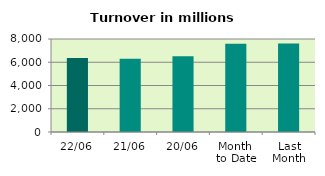
| Category | Series 0 |
|---|---|
| 22/06 | 6357.181 |
| 21/06 | 6295.404 |
| 20/06 | 6526.688 |
| Month 
to Date | 7599.463 |
| Last
Month | 7604.877 |